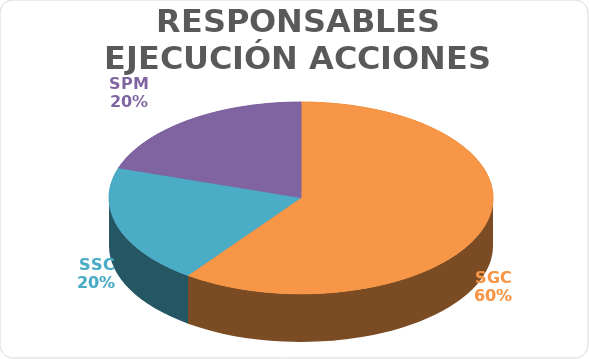
| Category | Series 0 |
|---|---|
| SGC | 3 |
| SSC | 1 |
| SPM | 1 |